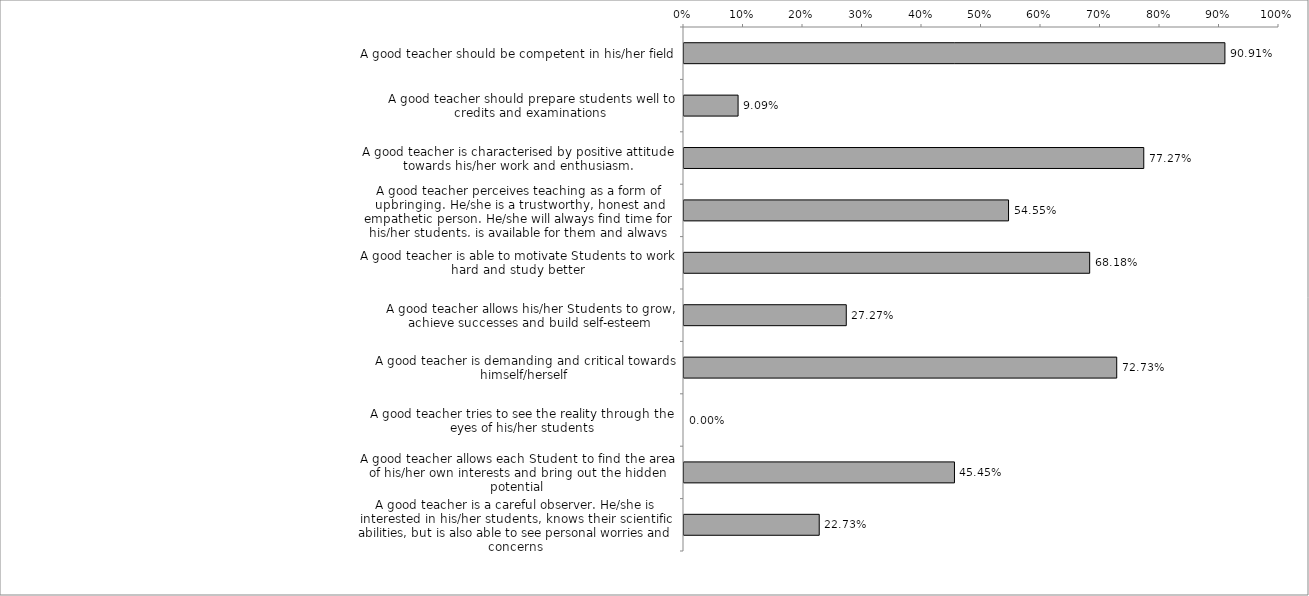
| Category | Procentowy udział respondentów |
|---|---|
| A good teacher should be competent in his/her field | 0.909 |
| A good teacher should prepare students well to credits and examinations | 0.091 |
| A good teacher is characterised by positive attitude towards his/her work and enthusiasm. | 0.773 |
| A good teacher perceives teaching as a form of upbringing. He/she is a trustworthy, honest and empathetic person. He/she will always find time for his/her students, is available for them and always provides advice and aid | 0.545 |
| A good teacher is able to motivate Students to work hard and study better | 0.682 |
| A good teacher allows his/her Students to grow, achieve successes and build self-esteem | 0.273 |
| A good teacher is demanding and critical towards himself/herself | 0.727 |
| A good teacher tries to see the reality through the eyes of his/her students | 0 |
| A good teacher allows each Student to find the area of his/her own interests and bring out the hidden potential | 0.455 |
| A good teacher is a careful observer. He/she is interested in his/her students, knows their scientific abilities, but is also able to see personal worries and concerns | 0.227 |